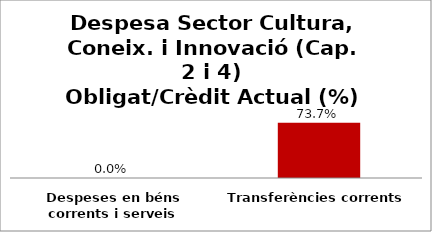
| Category | Series 0 |
|---|---|
| Despeses en béns corrents i serveis | 0 |
| Transferències corrents | 0.737 |